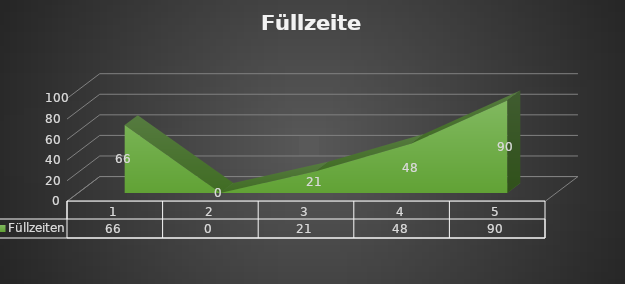
| Category | Füllzeiten |
|---|---|
| 0 | 66 |
| 1 | 0 |
| 2 | 21 |
| 3 | 48 |
| 4 | 90 |